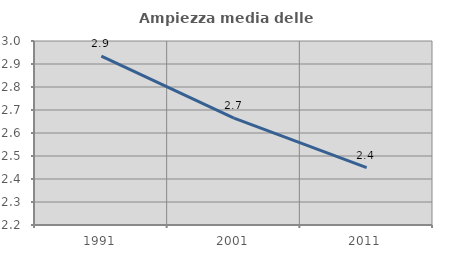
| Category | Ampiezza media delle famiglie |
|---|---|
| 1991.0 | 2.934 |
| 2001.0 | 2.665 |
| 2011.0 | 2.45 |